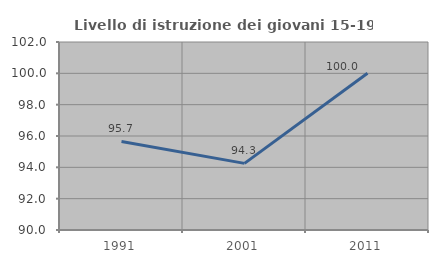
| Category | Livello di istruzione dei giovani 15-19 anni |
|---|---|
| 1991.0 | 95.652 |
| 2001.0 | 94.253 |
| 2011.0 | 100 |